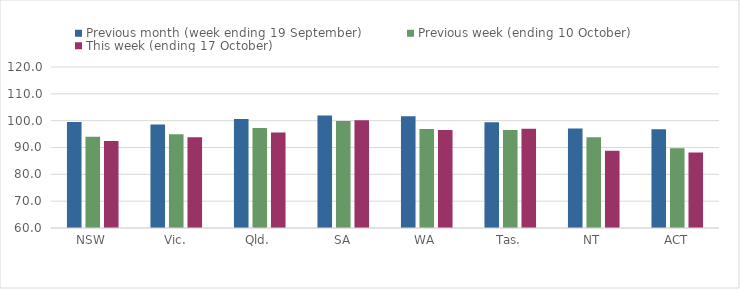
| Category | Previous month (week ending 19 September) | Previous week (ending 10 October) | This week (ending 17 October) |
|---|---|---|---|
| NSW | 99.49 | 94.02 | 92.38 |
| Vic. | 98.61 | 94.9 | 93.81 |
| Qld. | 100.65 | 97.26 | 95.58 |
| SA | 101.89 | 99.85 | 100.2 |
| WA | 101.65 | 96.92 | 96.52 |
| Tas. | 99.39 | 96.48 | 96.98 |
| NT | 97.05 | 93.85 | 88.82 |
| ACT | 96.81 | 89.72 | 88.18 |